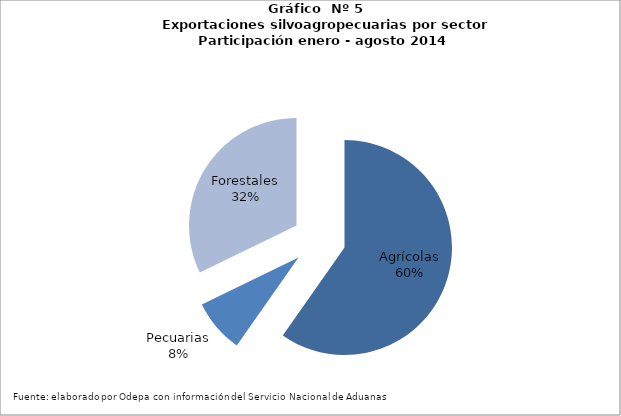
| Category | Series 0 |
|---|---|
| Agrícolas | 6637933 |
| Pecuarias | 894279 |
| Forestales | 3579941 |